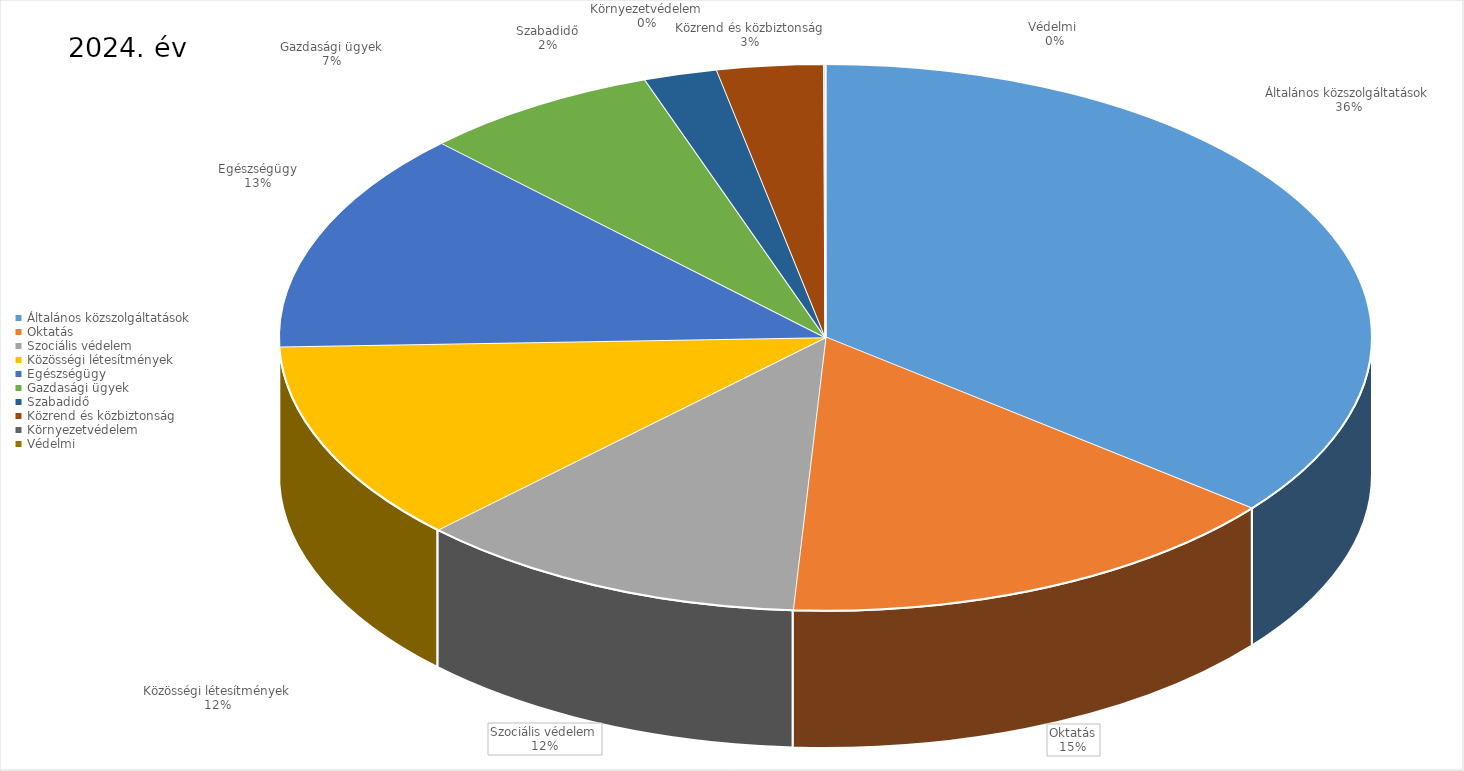
| Category | 2024. év |
|---|---|
| Általános közszolgáltatások | 18936206731 |
| Oktatás | 8044001656 |
| Szociális védelem | 6146299852 |
| Közösségi létesítmények | 6302765837 |
| Egészségügy | 6955649237 |
| Gazdasági ügyek | 3728002083 |
| Szabadidő | 1149199646 |
| Közrend és közbiztonság | 1666403927 |
| Környezetvédelem | 21437000 |
| Védelmi  | 2489200 |